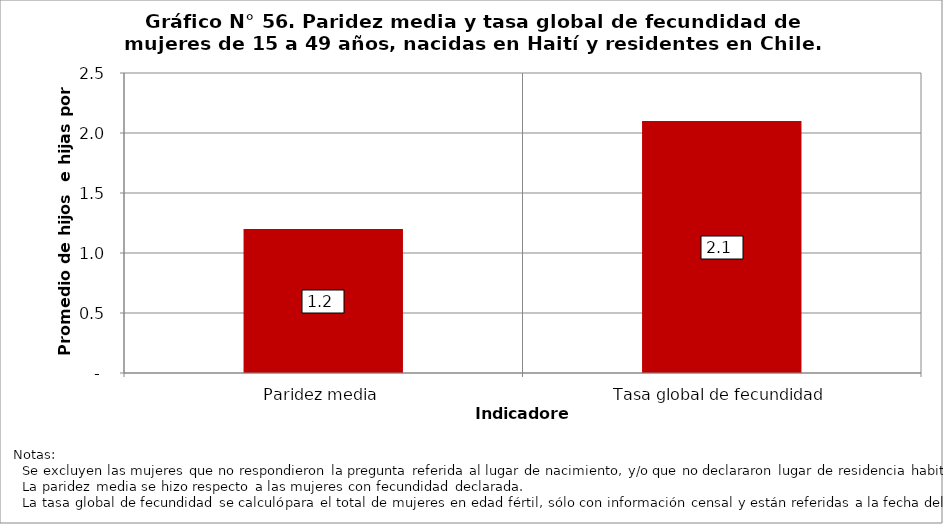
| Category | Haití |
|---|---|
| Paridez media | 1.2 |
| Tasa global de fecundidad | 2.1 |